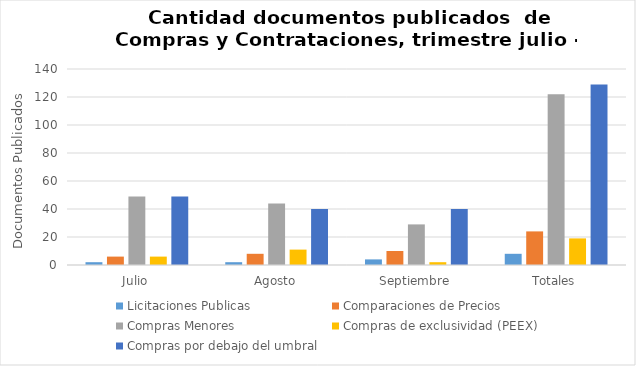
| Category | Licitaciones Publicas | Comparaciones de Precios | Compras Menores | Compras de exclusividad (PEEX) | Compras por debajo del umbral |
|---|---|---|---|---|---|
| Julio | 2 | 6 | 49 | 6 | 49 |
| Agosto | 2 | 8 | 44 | 11 | 40 |
| Septiembre | 4 | 10 | 29 | 2 | 40 |
| Totales | 8 | 24 | 122 | 19 | 129 |